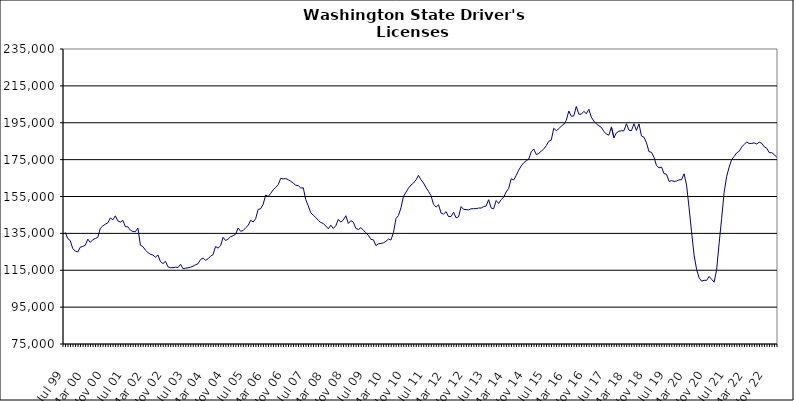
| Category | Series 0 |
|---|---|
| Jul 99 | 135560 |
| Aug 99 | 132182 |
| Sep 99 | 131104 |
| Oct 99 | 126694 |
| Nov 99 | 125425 |
| Dec 99 | 124927 |
| Jan 00 | 127499 |
| Feb 00 | 127927 |
| Mar 00 | 128547 |
| Apr 00 | 131834 |
| May 00 | 130120 |
| Jun 00 | 131595 |
| Jul 00 | 132236 |
| Aug 00 | 132819 |
| Sep 00 | 137711 |
| Oct 00 | 139063 |
| Nov 00 | 139952 |
| Dec 00 | 140732 |
| Jan 01 | 143338 |
| Feb 01 | 142359 |
| Mar 01 | 144523 |
| Apr 01 | 141758 |
| May 01 | 141135 |
| Jun 01 | 142064 |
| Jul 01 | 138646 |
| Aug 01 | 138530 |
| Sep 01 | 136784 |
| Oct 01 | 135996 |
| Nov 01 | 135917 |
| Dec 01 | 137940 |
| Jan 02 | 128531 |
| Feb 02 | 127848 |
| Mar 02 | 125876 |
| Apr 02 | 124595 |
| May 02 | 123660 |
| Jun 02 | 123282 |
| Jul 02 | 122089 |
| Aug 02 | 123279 |
| Sep 02 | 119727 |
| Oct 02 | 118588 |
| Nov 02 | 119854 |
| Dec 02 | 116851 |
| Jan 03 | 116407 |
| Feb 03 | 116382 |
| Mar 03 | 116648 |
| Apr 03 | 116471 |
| May 03 | 118231 |
| Jun 03 | 115831 |
| Jul 03 | 116082 |
| Aug 03 | 116341 |
| Sep 03 | 116653 |
| Oct 03 | 117212 |
| Nov 03 | 117962 |
| Dec 03 | 118542 |
| Jan 04 | 120817 |
| Feb 04 | 121617 |
| Mar 04 | 120369 |
| Apr 04 | 121200 |
| May 04 | 122609 |
| Jun 04 | 123484 |
| Jul 04 | 127844 |
| Aug 04 | 127025 |
| Sep 04 | 128273 |
| Oct 04 | 132853 |
| Nov 04 | 131106 |
| Dec 04 | 131935 |
| Jan 05 | 133205 |
| Feb 05 | 133736 |
| Mar 05 | 134528 |
| Apr 05 | 137889 |
| May 05 | 136130 |
| Jun 05 | 136523 |
| Jul 05 | 137997 |
| Aug 05 | 139294 |
| Sep 05 | 142140 |
| Oct 05 | 141192 |
| Nov 05 | 142937 |
| Dec 05 | 148013 |
| Jan 06 | 148341 |
| Feb 06 | 150744 |
| Mar 06 | 155794 |
| Apr 06 | 154984 |
| May 06 | 156651 |
| Jun 06 | 158638 |
| Jul 06 | 159911 |
| Aug 06 | 161445 |
| Sep 06 | 164852 |
| Oct 06 | 164570 |
| Nov 06 | 164679 |
| Dec 06 | 164127 |
| Jan 07 | 163271 |
| Feb 07 | 162273 |
| Mar 07 | 161140 |
| Apr 07 | 160860 |
| May 07 | 159633 |
| Jun 07 | 159724 |
| Jul 07 | 153303 |
| Aug 07 | 149939 |
| Sep 07 | 146172 |
| Oct 07 | 144876 |
| Nov 07 | 143613 |
| Dec 07 | 142022 |
| Jan 08 | 140909 |
| Feb 08 | 140368 |
| Mar 08 | 138998 |
| Apr 08 | 137471 |
| May 08 | 139453 |
| Jun 08 | 137680 |
| Jul 08 | 139120 |
| Aug 08 | 142612 |
| Sep-08 | 141071 |
| Oct 08 | 142313 |
| Nov 08 | 144556 |
| Dec 08 | 140394 |
| Jan 09 | 141903 |
| Feb 09 | 141036 |
| Mar 09 | 137751 |
| Apr 09 | 137060 |
| May 09 | 138101 |
| Jun 09 | 136739 |
| Jul 09 | 135317 |
| Aug 09 | 134020 |
| Sep 09 | 131756 |
| Oct 09 | 131488 |
| Nov 09 | 128370 |
| Dec 09 | 129323 |
| Jan 10 | 129531 |
| Feb 10 | 129848 |
| Mar 10 | 130654 |
| Apr 10 | 131929 |
| May 10 | 131429 |
| Jun 10 | 135357 |
| Jul 10 | 143032 |
| Aug 10 | 144686 |
| Sep 10 | 148856 |
| Oct 10 | 155042 |
| Nov 10 | 157328 |
| Dec 10 | 159501 |
| Jan 11 | 161221 |
| Feb 11 | 162312 |
| Mar 11 | 163996 |
| Apr 11 | 166495 |
| May 11 | 164040 |
| Jun 11 | 162324 |
| Jul 11 | 159862 |
| Aug 11 | 157738 |
| Sep 11 | 155430 |
| Oct 11 | 150762 |
| Nov 11 | 149255 |
| Dec 11 | 150533 |
| Jan 12 | 146068 |
| Feb 12 | 145446 |
| Mar 12 | 146788 |
| Apr 12 | 144110 |
| May 12 | 144162 |
| Jun 12 | 146482 |
| Jul 12 | 143445 |
| Aug 12 | 143950 |
| Sep 12 | 149520 |
| Oct 12 | 148033 |
| Nov 12 | 147926 |
| Dec 12 | 147674 |
| Jan 13 | 148360 |
| Feb-13 | 148388 |
| Mar-13 | 148414 |
| Apr 13 | 148749 |
| May 13 | 148735 |
| Jun-13 | 149521 |
| Jul 13 | 149837 |
| Aug 13 | 153252 |
| Sep 13 | 148803 |
| Oct 13 | 148315 |
| Nov 13 | 152804 |
| Dec 13 | 151209 |
| Jan 14 | 153357 |
| Feb-14 | 154608 |
| Mar 14 | 157479 |
| Apr 14 | 159441 |
| May 14 | 164591 |
| Jun 14 | 163995 |
| Jul-14 | 166411 |
| Aug-14 | 169272 |
| Sep 14 | 171565 |
| Oct 14 | 173335 |
| Nov 14 | 174406 |
| Dec 14 | 175302 |
| Jan 15 | 179204 |
| Feb 15 | 180737 |
| Mar 15 | 177810 |
| Apr-15 | 178331 |
| May 15 | 179601 |
| Jun-15 | 180729 |
| Jul 15 | 182540 |
| Aug 15 | 184924 |
| Sep 15 | 185620 |
| Oct 15 | 192002 |
| Nov 15 | 190681 |
| Dec 15 | 191795 |
| Jan 16 | 193132 |
| Feb 16 | 194206 |
| Mar 16 | 196319 |
| Apr 16 | 201373 |
| May 16 | 198500 |
| Jun 16 | 198743 |
| Jul 16 | 203841 |
| Aug 16 | 199630 |
| Sep 16 | 199655 |
| Oct 16 | 201181 |
| Nov 16 | 199888 |
| Dec 16 | 202304 |
| Jan 17 | 197977 |
| Feb 17 | 195889 |
| Mar 17 | 194438 |
| Apr 17 | 193335 |
| May 17 | 192430 |
| Jun 17 | 190298 |
| Jul 17 | 188832 |
| Aug 17 | 188264 |
| Sep 17 | 192738 |
| Oct 17 | 186856 |
| Nov 17 | 189537 |
| Dec 17 | 190341 |
| Jan 18 | 190670 |
| Feb 18 | 190645 |
| Mar 18 | 194476 |
| Apr 18 | 190971 |
| May 18 | 190707 |
| Jun 18 | 194516 |
| Jul 18 | 190783 |
| Aug 18 | 194390 |
| Sep 18 | 187831 |
| Oct 18 | 187188 |
| Nov 18 | 184054 |
| Dec 18 | 179347 |
| Jan 19 | 178958 |
| Feb 19 | 176289 |
| Mar 19 | 171747 |
| Apr 19 | 170532 |
| May 19 | 170967 |
| Jun 19 | 167444 |
| Jul 19 | 167059 |
| Aug 19 | 163194 |
| Sep 19 | 163599 |
| Oct 19 | 163212 |
| Nov 19 | 163388 |
| Dec 19 | 164024 |
| Jan 20 | 164114 |
| Feb 20 | 167320 |
| Mar 20 | 161221 |
| Apr 20 | 148866 |
| May 20 | 135821 |
| Jun 20 | 123252 |
| Jul 20 | 115526 |
| Aug 20 | 110940 |
| Sep 20 | 109099 |
| Oct 20 | 109566 |
| Nov 20 | 109488 |
| Dec 20 | 111658 |
| Jan 21 | 110070 |
| Feb 21 | 108491 |
| Mar 21 | 115176 |
| Apr 21 | 129726 |
| May 21 | 143052 |
| Jun 21 | 157253 |
| Jul 21 | 165832 |
| Aug 21 | 170937 |
| Sep 21 | 175042 |
| Oct 21 | 176696 |
| Nov 21 | 178677 |
| Dec 21 | 179501 |
| Jan 22 | 181825 |
| Feb 22 | 183258 |
| Mar 22 | 184618 |
| Apr 22 | 183710 |
| May 22 | 183784 |
| Jun 22 | 184101 |
| Jul 22 | 183443 |
| Aug 22 | 184475 |
| Sep 22 | 183902 |
| Oct 22 | 181994 |
| Nov 22 | 181207 |
| Dec 22 | 178793 |
| Jan 23 | 178782 |
| Feb 23 | 177647 |
| Mar 23 | 176386 |